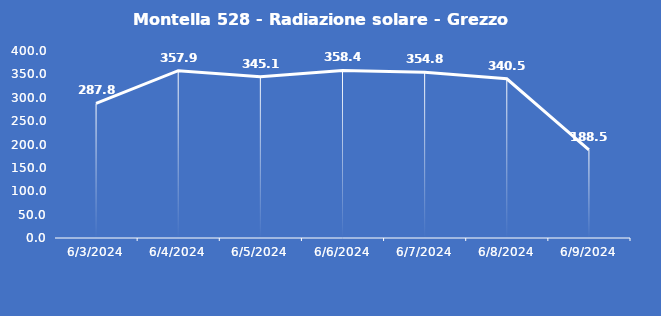
| Category | Montella 528 - Radiazione solare - Grezzo (W/m2) |
|---|---|
| 6/3/24 | 287.8 |
| 6/4/24 | 357.9 |
| 6/5/24 | 345.1 |
| 6/6/24 | 358.4 |
| 6/7/24 | 354.8 |
| 6/8/24 | 340.5 |
| 6/9/24 | 188.5 |